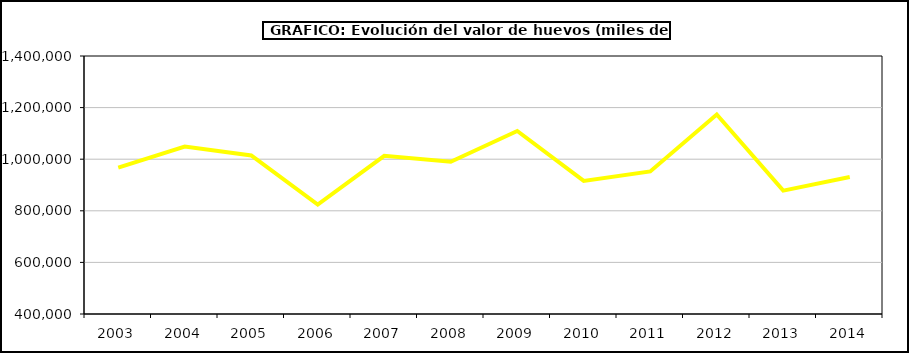
| Category | huevos |
|---|---|
| 2003.0 | 966991.3 |
| 2004.0 | 1049094.98 |
| 2005.0 | 1014518.979 |
| 2006.0 | 823874.691 |
| 2007.0 | 1012879.578 |
| 2008.0 | 990180.415 |
| 2009.0 | 1109356.704 |
| 2010.0 | 915832.84 |
| 2011.0 | 952462.311 |
| 2012.0 | 1173176.818 |
| 2013.0 | 878243.026 |
| 2014.0 | 930912.202 |